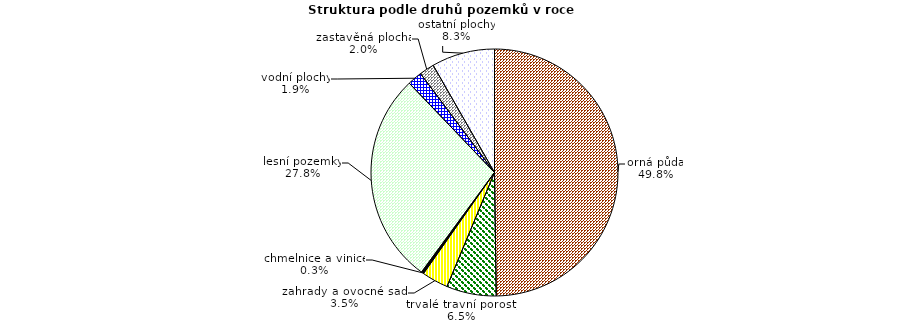
| Category | Struktura druhů pozemků |
|---|---|
| orná půda | 548308 |
| trvalé travní porosty | 71691 |
| zahrady a ovocné sady | 38185 |
| chmelnice a vinice | 3468 |
| lesní pozemky | 306292 |
| vodní plochy | 20990 |
| zastavěná plocha | 21545 |
| ostatní plochy | 91090 |